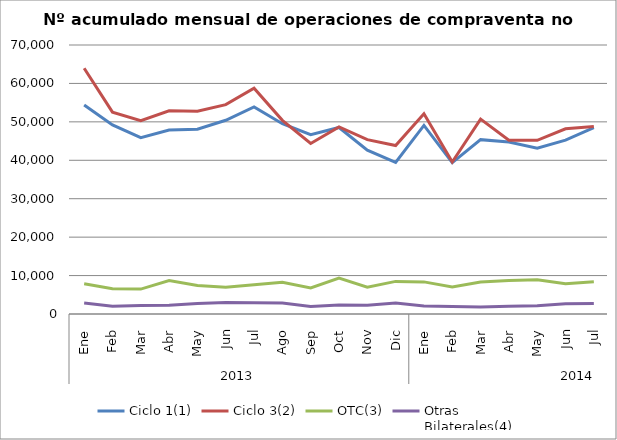
| Category | Ciclo 1(1) | Ciclo 3(2) | OTC(3) | Otras
Bilaterales(4) |
|---|---|---|---|---|
| 0 | 54386 | 63960 | 7873 | 2891 |
| 1 | 49196 | 52525 | 6550 | 2012 |
| 2 | 45892 | 50320 | 6475 | 2233 |
| 3 | 47876 | 52874 | 8686 | 2274 |
| 4 | 48091 | 52767 | 7394 | 2733 |
| 5 | 50415 | 54485 | 6994 | 3021 |
| 6 | 53879 | 58744 | 7586 | 2959 |
| 7 | 49504 | 50401 | 8243 | 2889 |
| 8 | 46688 | 44370 | 6784 | 1951 |
| 9 | 48531 | 48693 | 9357 | 2324 |
| 10 | 42642 | 45362 | 7000 | 2275 |
| 11 | 39447 | 43831 | 8487 | 2831 |
| 12 | 49087 | 52117 | 8357 | 2090 |
| 13 | 39397 | 39565 | 7045 | 1958 |
| 14 | 45373 | 50721 | 8313 | 1843 |
| 15 | 44744 | 45214 | 8739 | 2016 |
| 16 | 43118 | 45196 | 8896 | 2164 |
| 17 | 45225 | 48182 | 7881 | 2648 |
| 18 | 48478 | 48790 | 8413 | 2759 |